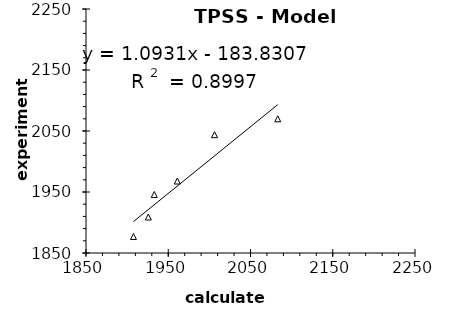
| Category | B3LYP |
|---|---|
| 1907.691256830601 | 1877 |
| 1925.77868852459 | 1909 |
| 1933.013661202186 | 1946 |
| 1961.049180327869 | 1968 |
| 2006.267759562842 | 2044 |
| 2083.139344262295 | 2070 |